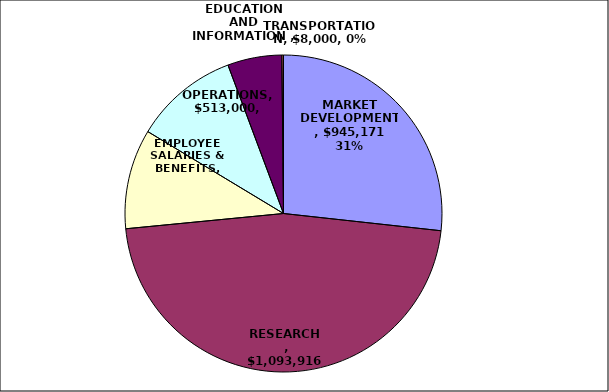
| Category | Series 0 | Series 1 |
|---|---|---|
| MARKET DEVELOPMENT  | 1286819 | 0.267 |
| RESEARCH   | 2248827 | 0.467 |
| EMPLOYEE SALARIES & BENEFITS | 490000 | 0.102 |
| OPERATIONS | 513000 | 0.107 |
| EDUCATION AND INFORMATION  | 266261 | 0.055 |
| TRANSPORTATION | 8000 | 0.002 |